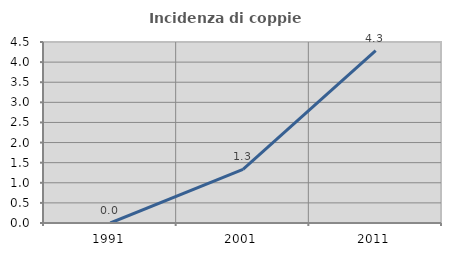
| Category | Incidenza di coppie miste |
|---|---|
| 1991.0 | 0 |
| 2001.0 | 1.333 |
| 2011.0 | 4.286 |